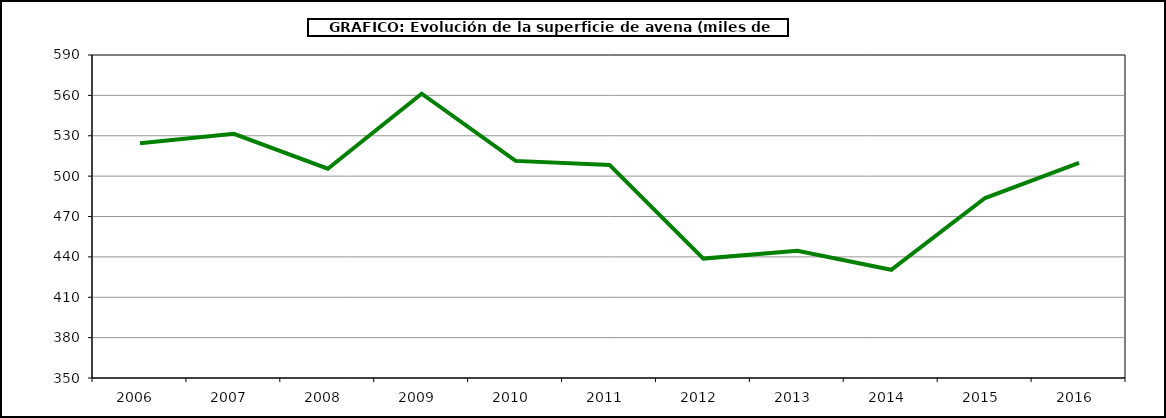
| Category | Superficie |
|---|---|
| 2006.0 | 524.389 |
| 2007.0 | 531.432 |
| 2008.0 | 505.511 |
| 2009.0 | 561.238 |
| 2010.0 | 511.329 |
| 2011.0 | 508.344 |
| 2012.0 | 438.745 |
| 2013.0 | 444.474 |
| 2014.0 | 430.419 |
| 2015.0 | 483.727 |
| 2016.0 | 509.849 |